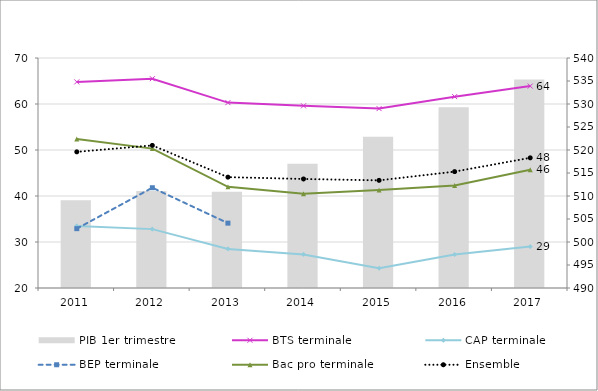
| Category | PIB 1er trimestre |
|---|---|
| 2011.0 | 509.1 |
| 2012.0 | 511.1 |
| 2013.0 | 510.9 |
| 2014.0 | 517 |
| 2015.0 | 522.9 |
| 2016.0 | 529.3 |
| 2017.0 | 535.3 |